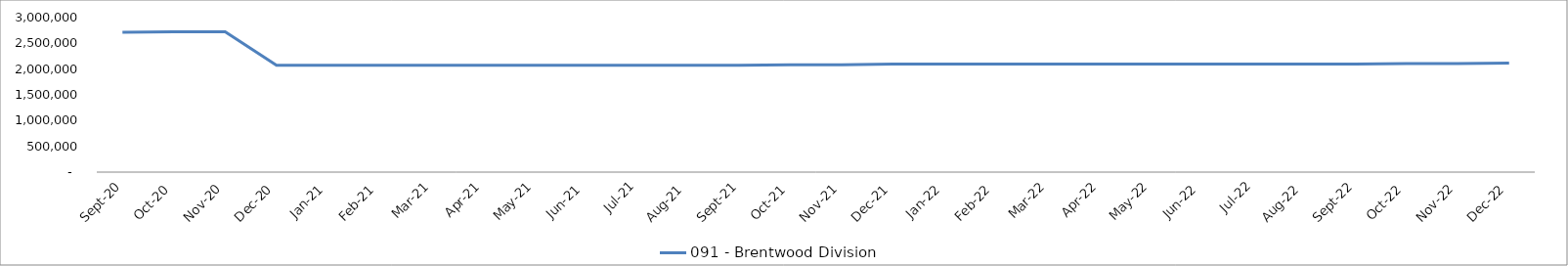
| Category | 091 - Brentwood Division |
|---|---|
| 2020-09-30 | 2714030.44 |
| 2020-10-31 | 2726297.29 |
| 2020-11-30 | 2726297.29 |
| 2020-12-31 | 2075192.66 |
| 2021-01-31 | 2075192.66 |
| 2021-02-28 | 2075192.66 |
| 2021-03-31 | 2073159.67 |
| 2021-04-30 | 2073159.67 |
| 2021-05-31 | 2073159.65 |
| 2021-06-30 | 2073159.65 |
| 2021-07-31 | 2073159.65 |
| 2021-08-31 | 2073159.65 |
| 2021-09-30 | 2073159.7 |
| 2021-10-31 | 2085426.55 |
| 2021-11-30 | 2085426.55 |
| 2021-12-31 | 2095969.76 |
| 2022-01-31 | 2095969.76 |
| 2022-02-28 | 2095969.76 |
| 2022-03-31 | 2095969.76 |
| 2022-04-30 | 2095969.76 |
| 2022-05-31 | 2095969.74 |
| 2022-06-30 | 2095969.74 |
| 2022-07-31 | 2095969.74 |
| 2022-08-31 | 2095969.74 |
| 2022-09-30 | 2095969.79 |
| 2022-10-31 | 2108236.64 |
| 2022-11-30 | 2108236.64 |
| 2022-12-31 | 2118779.85 |